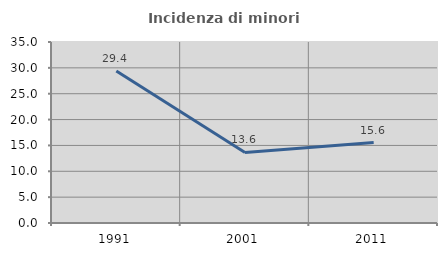
| Category | Incidenza di minori stranieri |
|---|---|
| 1991.0 | 29.412 |
| 2001.0 | 13.636 |
| 2011.0 | 15.556 |